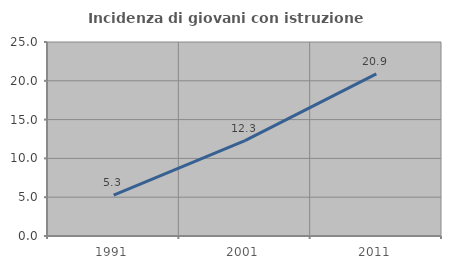
| Category | Incidenza di giovani con istruzione universitaria |
|---|---|
| 1991.0 | 5.27 |
| 2001.0 | 12.281 |
| 2011.0 | 20.89 |